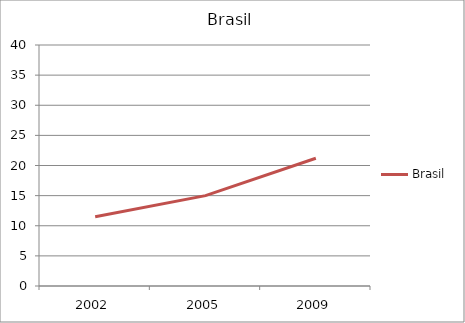
| Category | Brasil |
|---|---|
| 2002.0 | 11.5 |
| 2005.0 | 15 |
| 2009.0 | 21.2 |